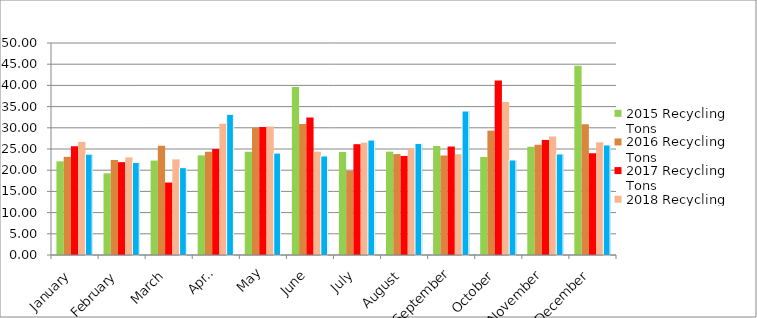
| Category | 2015 Recycling Tons | 2016 Recycling Tons | 2017 Recycling Tons | 2018 Recycling tons | 2019 Recycling Tons |
|---|---|---|---|---|---|
| January | 22.1 | 23.14 | 25.62 | 26.67 | 23.78 |
| February | 19.26 | 22.41 | 21.9 | 23.02 | 21.84 |
| March | 22.27 | 25.74 | 17.1 | 22.55 | 20.6 |
| April | 23.5 | 24.35 | 25 | 30.96 | 33.17 |
| May | 24.33 | 30.02 | 30.19 | 30.3 | 24.04 |
| June | 39.6 | 30.88 | 32.41 | 24.37 | 23.36 |
| July | 24.31 | 19.81 | 26.13 | 26.5 | 27.11 |
| August | 24.37 | 23.8 | 23.36 | 25.17 | 26.31 |
| September | 25.71 | 23.47 | 25.59 | 23.77 | 33.96 |
| October | 23.11 | 29.33 | 41.13 | 36.09 | 22.41 |
| November | 25.54 | 26 | 27.14 | 27.96 | 23.83 |
| December | 44.65 | 30.82 | 23.99 | 26.57 | 25.95 |